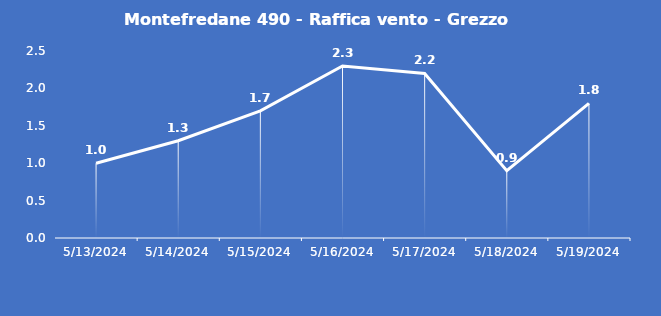
| Category | Montefredane 490 - Raffica vento - Grezzo (m/s) |
|---|---|
| 5/13/24 | 1 |
| 5/14/24 | 1.3 |
| 5/15/24 | 1.7 |
| 5/16/24 | 2.3 |
| 5/17/24 | 2.2 |
| 5/18/24 | 0.9 |
| 5/19/24 | 1.8 |